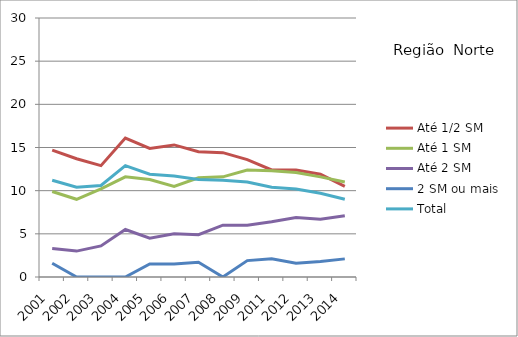
| Category | Até 1/2 SM | Até 1 SM | Até 2 SM | 2 SM ou mais | Total |
|---|---|---|---|---|---|
| 2001.0 | 14.7 | 9.9 | 3.3 | 1.6 | 11.2 |
| 2002.0 | 13.7 | 9 | 3 | 0 | 10.4 |
| 2003.0 | 12.9 | 10.2 | 3.6 | 0 | 10.6 |
| 2004.0 | 16.1 | 11.6 | 5.5 | 0 | 12.9 |
| 2005.0 | 14.9 | 11.3 | 4.5 | 1.5 | 11.9 |
| 2006.0 | 15.3 | 10.5 | 5 | 1.5 | 11.7 |
| 2007.0 | 14.5 | 11.5 | 4.9 | 1.7 | 11.3 |
| 2008.0 | 14.4 | 11.6 | 6 | 0 | 11.2 |
| 2009.0 | 13.6 | 12.4 | 6 | 1.9 | 11 |
| 2011.0 | 12.4 | 12.3 | 6.4 | 2.1 | 10.4 |
| 2012.0 | 12.4 | 12.1 | 6.9 | 1.6 | 10.2 |
| 2013.0 | 11.9 | 11.6 | 6.7 | 1.8 | 9.7 |
| 2014.0 | 10.5 | 11 | 7.1 | 2.1 | 9 |